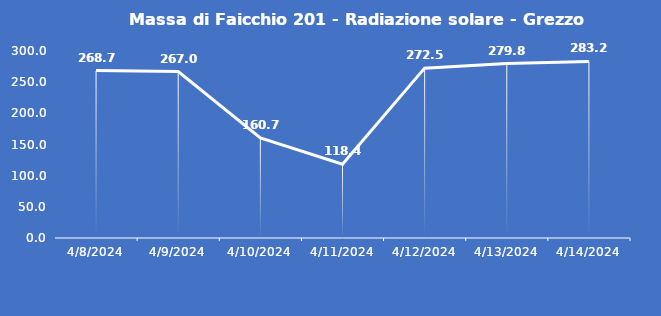
| Category | Massa di Faicchio 201 - Radiazione solare - Grezzo (W/m2) |
|---|---|
| 4/8/24 | 268.7 |
| 4/9/24 | 267 |
| 4/10/24 | 160.7 |
| 4/11/24 | 118.4 |
| 4/12/24 | 272.5 |
| 4/13/24 | 279.8 |
| 4/14/24 | 283.2 |